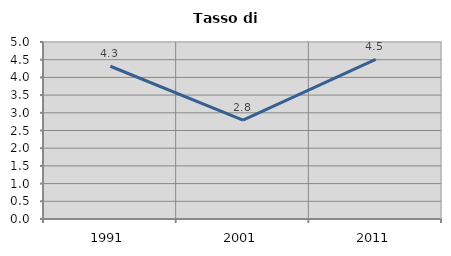
| Category | Tasso di disoccupazione   |
|---|---|
| 1991.0 | 4.315 |
| 2001.0 | 2.794 |
| 2011.0 | 4.511 |